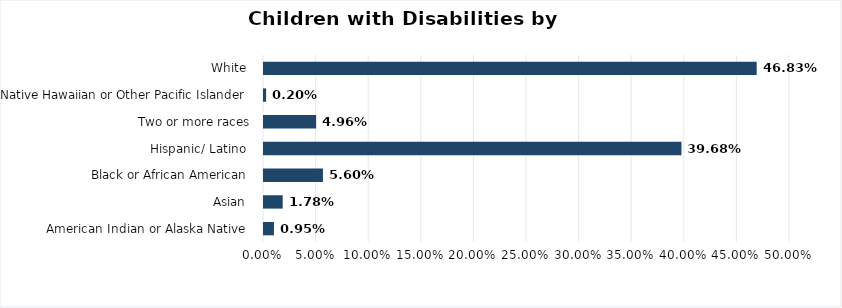
| Category | Series 0 |
|---|---|
| American Indian or Alaska Native  | 0.009 |
| Asian  | 0.018 |
| Black or African American  | 0.056 |
| Hispanic/ Latino  | 0.397 |
| Two or more races | 0.05 |
| Native Hawaiian or Other Pacific Islander  | 0.002 |
| White  | 0.468 |